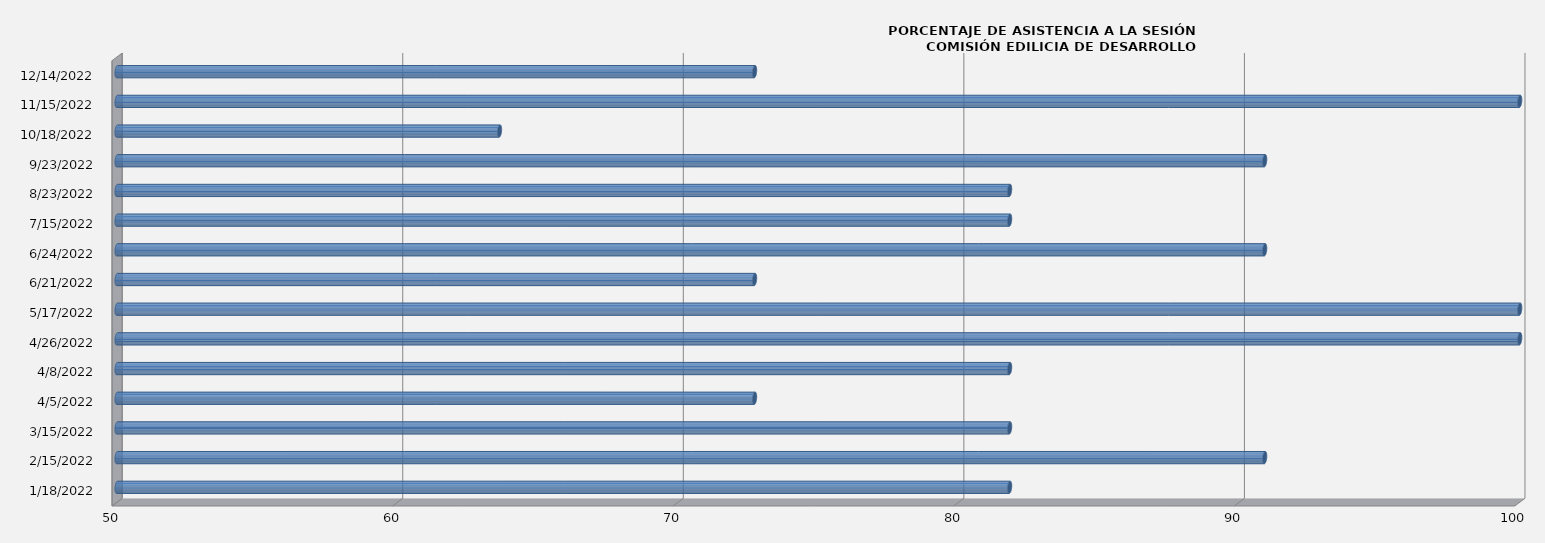
| Category | Series 0 |
|---|---|
| 1/18/22 | 81.818 |
| 2/15/22 | 90.909 |
| 3/15/22 | 81.818 |
| 4/5/22 | 72.727 |
| 4/8/22 | 81.818 |
| 4/26/22 | 100 |
| 5/17/22 | 100 |
| 6/21/22 | 72.727 |
| 6/24/22 | 90.909 |
| 7/15/22 | 81.818 |
| 8/23/22 | 81.818 |
| 9/23/22 | 90.909 |
| 10/18/22 | 63.636 |
| 11/15/22 | 100 |
| 12/14/22 | 72.727 |